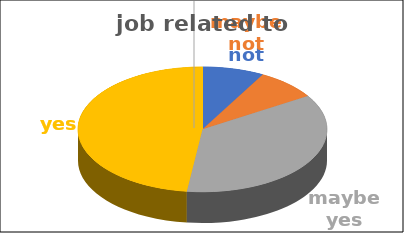
| Category | job related to studies | Series 1 | Series 2 | Series 3 | Series 4 |
|---|---|---|---|---|---|
| not | 0.08 |  |  |  |  |
| maybe not | 0.08 |  |  |  |  |
| maybe yes | 0.36 |  |  |  |  |
| yes | 0.48 |  |  |  |  |